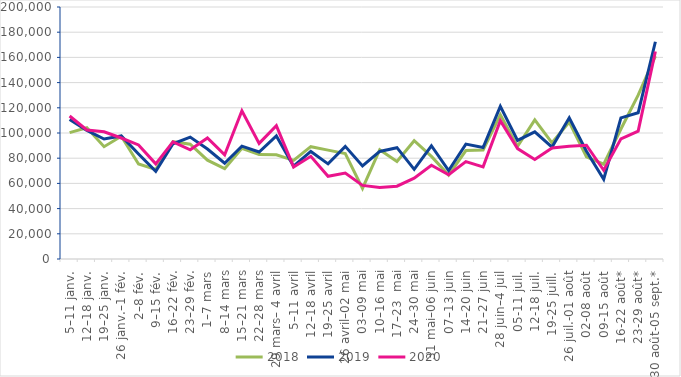
| Category | 2018 | 2019 | 2020 |
|---|---|---|---|
| 5–11 janv. | 100330 | 110701 | 113506 |
| 12–18 janv. | 104190 | 102045 | 102407 |
| 19–25 janv. | 89142 | 95260 | 100966 |
| 26 janv.–1 fév. | 97441 | 97699 | 96042 |
| 2–8 fév. | 75434 | 83347 | 90495 |
| 9–15 fév. | 71031 | 69559 | 75523 |
| 16–22 fév. | 93102 | 91428 | 93003 |
| 23–29 fév. | 91065 | 96774 | 86699 |
| 1–7 mars | 78415 | 87314 | 96119 |
| 8–14 mars | 71697 | 76021 | 82690 |
| 15–21 mars | 87845 | 89536 | 117673 |
| 22–28 mars | 82895 | 84912 | 91763.636 |
| 29 mars– 4 avril | 82654 | 97699 | 105802 |
| 5–11 avril | 78244 | 73699 | 73060.606 |
| 12–18 avril | 89129 | 85348 | 81477 |
| 19–25 avril | 86398 | 75509 | 65653 |
| 26 avril–02 mai | 83743 | 89413 | 68188 |
| 03–09 mai | 56008 | 73891 | 58423 |
| 10–16 mai | 86722 | 85364 | 56762 |
| 17–23  mai | 77423 | 88345 | 57817 |
| 24–30 mai | 93888 | 71115 | 64117 |
| 31 mai–06 juin | 81416 | 89880 | 74412 |
| 07–13 juin | 66658 | 70150 | 66851 |
| 14–20 juin | 86057 | 91157 | 77340 |
| 21–27 juin | 86474 | 88454 | 73165 |
| 28 juin–4 juil | 114502 | 121118 | 109774 |
| 05-11 juil. | 89389 | 94137 | 87596 |
| 12-18 juil. | 110384 | 100940 | 78915 |
| 19-25 juill. | 92231 | 88807 | 88097 |
| 26 juil.-01 août | 108699 | 112047 | 89418 |
| 02-08 août | 81067 | 85538 | 90304 |
| 09-15 août | 75229 | 63347 | 70433 |
| 16-22 août* | 103158 | 111994 | 95333 |
| 23-29 août* | 130053 | 116047 | 101472 |
| 30 août-05 sept.* | 161020 | 172405 | 164674 |